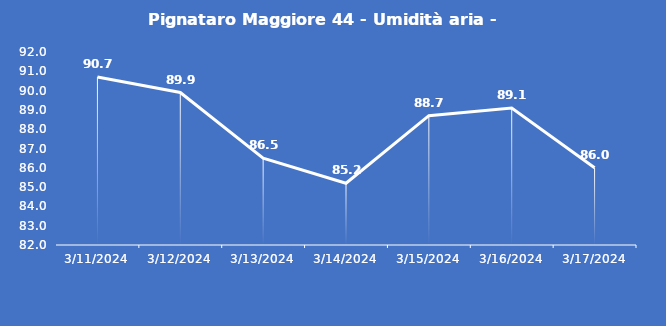
| Category | Pignataro Maggiore 44 - Umidità aria - Grezzo (%) |
|---|---|
| 3/11/24 | 90.7 |
| 3/12/24 | 89.9 |
| 3/13/24 | 86.5 |
| 3/14/24 | 85.2 |
| 3/15/24 | 88.7 |
| 3/16/24 | 89.1 |
| 3/17/24 | 86 |